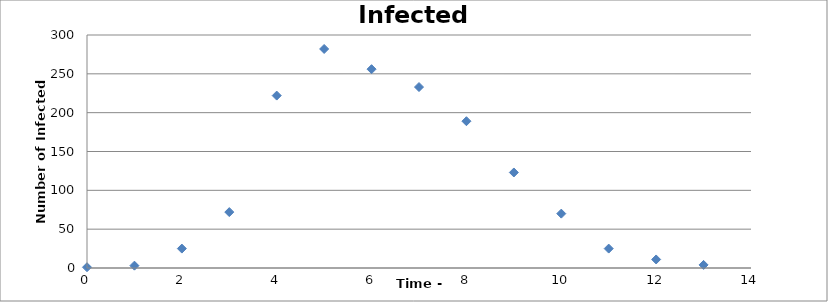
| Category | Series 0 |
|---|---|
| 0.0 | 1 |
| 1.0 | 3 |
| 2.0 | 25 |
| 3.0 | 72 |
| 4.0 | 222 |
| 5.0 | 282 |
| 6.0 | 256 |
| 7.0 | 233 |
| 8.0 | 189 |
| 8.99999999999999 | 123 |
| 9.99999999999999 | 70 |
| 11.0 | 25 |
| 12.0 | 11 |
| 13.0 | 4 |